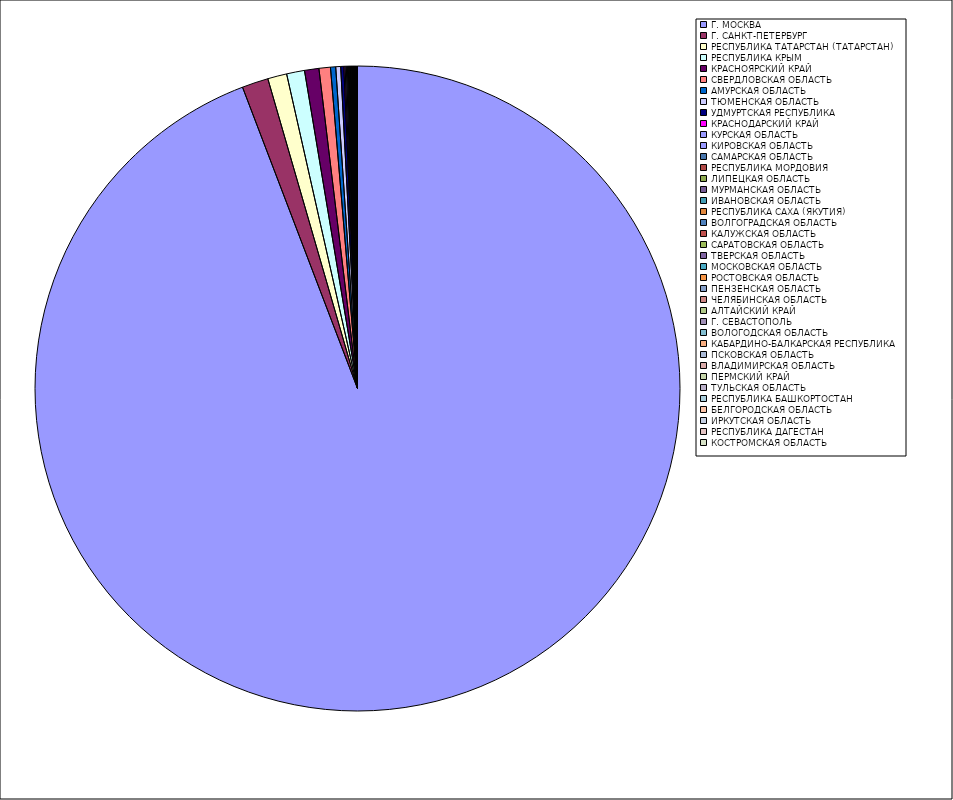
| Category | Оборот |
|---|---|
| Г. МОСКВА | 94.17 |
| Г. САНКТ-ПЕТЕРБУРГ | 1.317 |
| РЕСПУБЛИКА ТАТАРСТАН (ТАТАРСТАН) | 0.957 |
| РЕСПУБЛИКА КРЫМ | 0.898 |
| КРАСНОЯРСКИЙ КРАЙ | 0.72 |
| СВЕРДЛОВСКАЯ ОБЛАСТЬ | 0.572 |
| АМУРСКАЯ ОБЛАСТЬ | 0.26 |
| ТЮМЕНСКАЯ ОБЛАСТЬ | 0.246 |
| УДМУРТСКАЯ РЕСПУБЛИКА | 0.155 |
| КРАСНОДАРСКИЙ КРАЙ | 0.062 |
| КУРСКАЯ ОБЛАСТЬ | 0.061 |
| КИРОВСКАЯ ОБЛАСТЬ | 0.052 |
| САМАРСКАЯ ОБЛАСТЬ | 0.045 |
| РЕСПУБЛИКА МОРДОВИЯ | 0.04 |
| ЛИПЕЦКАЯ ОБЛАСТЬ | 0.033 |
| МУРМАНСКАЯ ОБЛАСТЬ | 0.032 |
| ИВАНОВСКАЯ ОБЛАСТЬ | 0.031 |
| РЕСПУБЛИКА САХА (ЯКУТИЯ) | 0.03 |
| ВОЛГОГРАДСКАЯ ОБЛАСТЬ | 0.029 |
| КАЛУЖСКАЯ ОБЛАСТЬ | 0.028 |
| САРАТОВСКАЯ ОБЛАСТЬ | 0.023 |
| ТВЕРСКАЯ ОБЛАСТЬ | 0.02 |
| МОСКОВСКАЯ ОБЛАСТЬ | 0.019 |
| РОСТОВСКАЯ ОБЛАСТЬ | 0.018 |
| ПЕНЗЕНСКАЯ ОБЛАСТЬ | 0.015 |
| ЧЕЛЯБИНСКАЯ ОБЛАСТЬ | 0.014 |
| АЛТАЙСКИЙ КРАЙ | 0.014 |
| Г. СЕВАСТОПОЛЬ | 0.013 |
| ВОЛОГОДСКАЯ ОБЛАСТЬ | 0.013 |
| КАБАРДИНО-БАЛКАРСКАЯ РЕСПУБЛИКА | 0.013 |
| ПСКОВСКАЯ ОБЛАСТЬ | 0.01 |
| ВЛАДИМИРСКАЯ ОБЛАСТЬ | 0.01 |
| ПЕРМСКИЙ КРАЙ | 0.01 |
| ТУЛЬСКАЯ ОБЛАСТЬ | 0.009 |
| РЕСПУБЛИКА БАШКОРТОСТАН | 0.009 |
| БЕЛГОРОДСКАЯ ОБЛАСТЬ | 0.007 |
| ИРКУТСКАЯ ОБЛАСТЬ | 0.007 |
| РЕСПУБЛИКА ДАГЕСТАН | 0.006 |
| КОСТРОМСКАЯ ОБЛАСТЬ | 0.005 |